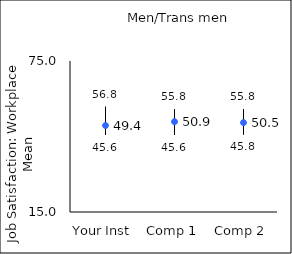
| Category | 25th percentile | 75th percentile | Mean |
|---|---|---|---|
| Your Inst | 45.6 | 56.8 | 49.36 |
| Comp 1 | 45.6 | 55.8 | 50.89 |
| Comp 2 | 45.8 | 55.8 | 50.52 |